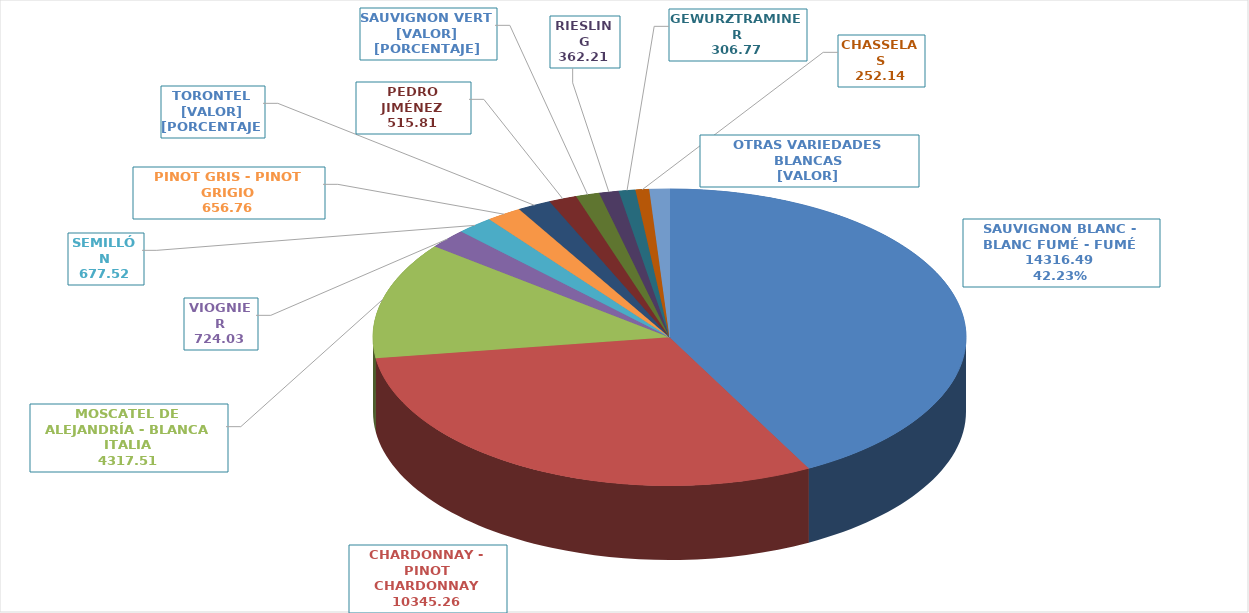
| Category | Series 0 |
|---|---|
| SAUVIGNON BLANC - BLANC FUMÉ - FUMÉ | 14316.49 |
| CHARDONNAY - PINOT CHARDONNAY | 10345.26 |
| MOSCATEL DE ALEJANDRÍA - BLANCA ITALIA | 4317.51 |
| VIOGNIER | 724.03 |
| SEMILLÓN | 677.52 |
| PINOT GRIS - PINOT GRIGIO | 656.76 |
| TORONTEL - TORRONTÉS - TORRONTÉS RIOJANO | 621.24 |
| PEDRO JIMÉNEZ | 515.81 |
| SAUVIGNON VERT - FRIULANO | 436.29 |
| RIESLING | 362.21 |
| GEWURZTRAMINER | 306.77 |
| CHASSELAS | 252.14 |
| OTRAS 34 VARIEDADES | 369.85 |